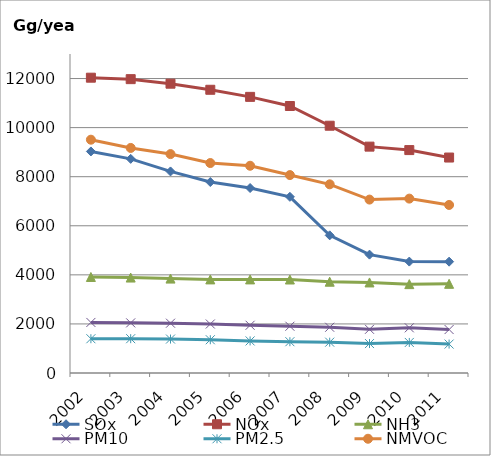
| Category | SOx | NOx | NH3 | PM10 | PM2.5 | NMVOC |
|---|---|---|---|---|---|---|
| 2002 | 9029.139 | 12034.596 | 3913.041 | 2060.224 | 1396.896 | 9507.433 |
| 2003 | 8726.577 | 11974.911 | 3889.752 | 2042.913 | 1398.696 | 9171.704 |
| 2004 | 8214.759 | 11790.119 | 3847.849 | 2029.712 | 1383.496 | 8920.986 |
| 2005 | 7782.264 | 11542.109 | 3813.943 | 1996.368 | 1355.561 | 8556.162 |
| 2006 | 7538.071 | 11253.176 | 3813.551 | 1945.437 | 1307.165 | 8445.575 |
| 2007 | 7179.452 | 10880.418 | 3810.205 | 1905.329 | 1275.262 | 8065.962 |
| 2008 | 5609.917 | 10076.96 | 3720.08 | 1863.995 | 1255.841 | 7689.212 |
| 2009 | 4823.561 | 9225.041 | 3690.383 | 1781.002 | 1200.036 | 7067.24 |
| 2010 | 4540.289 | 9084.261 | 3621.447 | 1841.011 | 1245.489 | 7106.753 |
| 2011 | 4537.468 | 8780.317 | 3634.584 | 1771.341 | 1179.23 | 6848.273 |